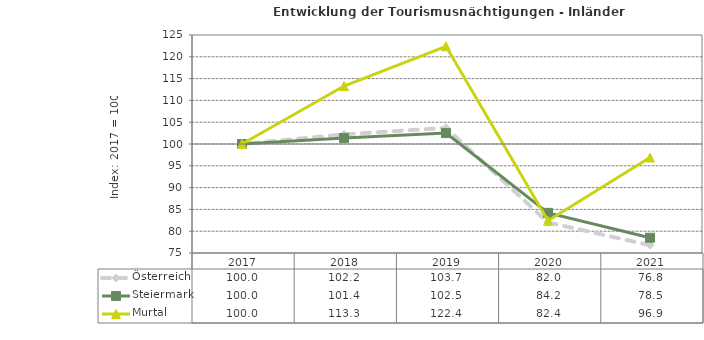
| Category | Österreich | Steiermark | Murtal |
|---|---|---|---|
| 2021.0 | 76.8 | 78.5 | 96.9 |
| 2020.0 | 82 | 84.2 | 82.4 |
| 2019.0 | 103.7 | 102.5 | 122.4 |
| 2018.0 | 102.2 | 101.4 | 113.3 |
| 2017.0 | 100 | 100 | 100 |